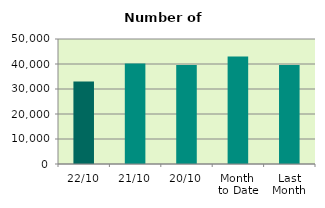
| Category | Series 0 |
|---|---|
| 22/10 | 33032 |
| 21/10 | 40174 |
| 20/10 | 39560 |
| Month 
to Date | 43001.5 |
| Last
Month | 39557.091 |